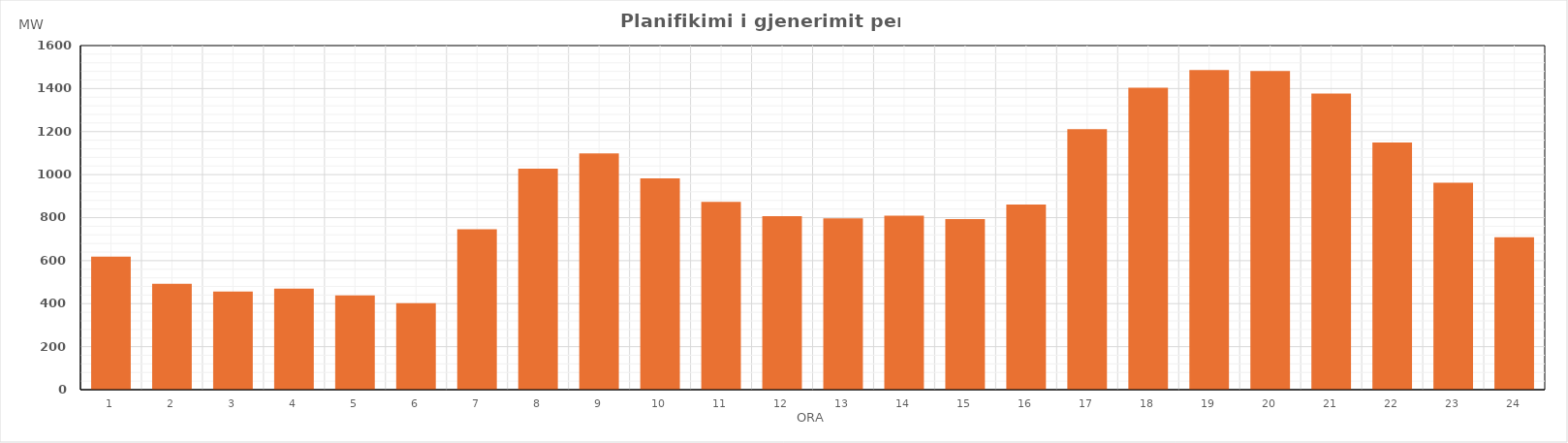
| Category | Max (MW) |
|---|---|
| 0 | 619.12 |
| 1 | 492.72 |
| 2 | 456.62 |
| 3 | 469.83 |
| 4 | 438.32 |
| 5 | 402.64 |
| 6 | 745.98 |
| 7 | 1027.46 |
| 8 | 1098.88 |
| 9 | 982.79 |
| 10 | 873.78 |
| 11 | 806.67 |
| 12 | 797.14 |
| 13 | 809.42 |
| 14 | 793.65 |
| 15 | 860.51 |
| 16 | 1211.71 |
| 17 | 1403.7 |
| 18 | 1486.29 |
| 19 | 1481.78 |
| 20 | 1377.37 |
| 21 | 1149.57 |
| 22 | 962.28 |
| 23 | 708.98 |